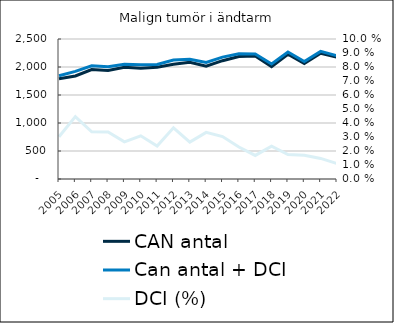
| Category |  CAN antal  |  Can antal + DCI  |
|---|---|---|
| 2005.0 | 1790 | 1844 |
| 2006.0 | 1840 | 1922 |
| 2007.0 | 1955 | 2021 |
| 2008.0 | 1938 | 2003 |
| 2009.0 | 1994 | 2047 |
| 2010.0 | 1979 | 2040 |
| 2011.0 | 1997 | 2044 |
| 2012.0 | 2050 | 2125 |
| 2013.0 | 2085 | 2140 |
| 2014.0 | 2013 | 2080 |
| 2015.0 | 2113 | 2177 |
| 2016.0 | 2187 | 2237 |
| 2017.0 | 2197 | 2234 |
| 2018.0 | 2008 | 2055 |
| 2019.0 | 2228 | 2267 |
| 2020.0 | 2064 | 2099 |
| 2021.0 | 2246 | 2279 |
| 2022.0 | 2176 | 2200 |